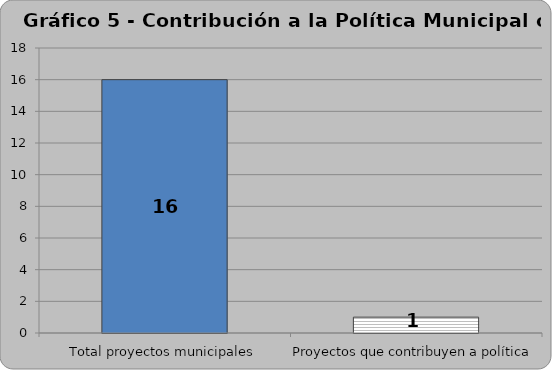
| Category | Series 0 |
|---|---|
| Total proyectos municipales | 16 |
| Proyectos que contribuyen a política | 1 |